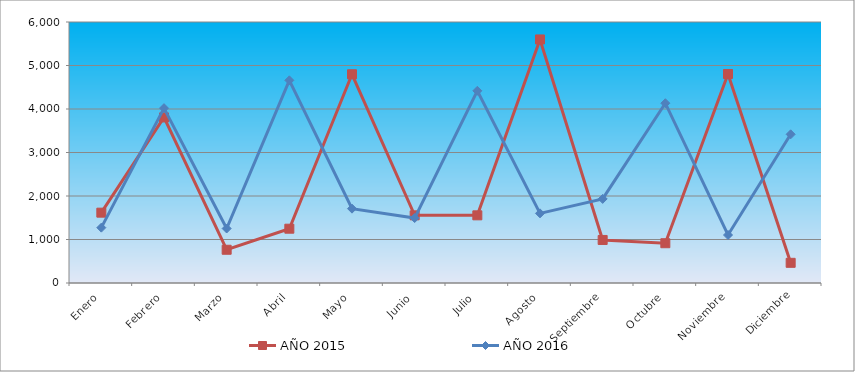
| Category | AÑO 2015 | AÑO 2016 |
|---|---|---|
| Enero | 1616.882 | 1272.359 |
| Febrero | 3806.25 | 4019.476 |
| Marzo | 764.096 | 1252.744 |
| Abril | 1248.479 | 4658.965 |
| Mayo | 4798.208 | 1709.041 |
| Junio | 1555.482 | 1493.337 |
| Julio | 1555.482 | 4418.226 |
| Agosto | 5599.111 | 1601.189 |
| Septiembre | 989.232 | 1933.041 |
| Octubre | 914.187 | 4133.188 |
| Noviembre | 4805.211 | 1103.41 |
| Diciembre | 463.916 | 3418.082 |